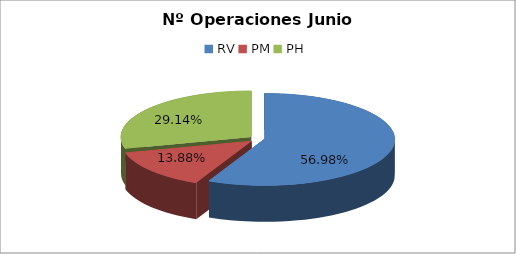
| Category | Series 0 |
|---|---|
| RV | 16473 |
| PM | 4014 |
| PH | 8423 |